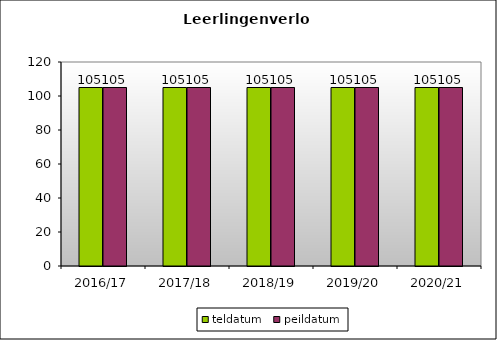
| Category | teldatum | peildatum |
|---|---|---|
| 2016/17 | 105 | 105 |
| 2017/18 | 105 | 105 |
| 2018/19 | 105 | 105 |
| 2019/20 | 105 | 105 |
| 2020/21 | 105 | 105 |